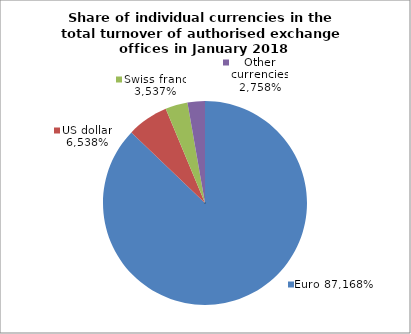
| Category | EUR |
|---|---|
| 0 | 0.872 |
| 1 | 0.065 |
| 2 | 0.035 |
| 3 | 0.028 |